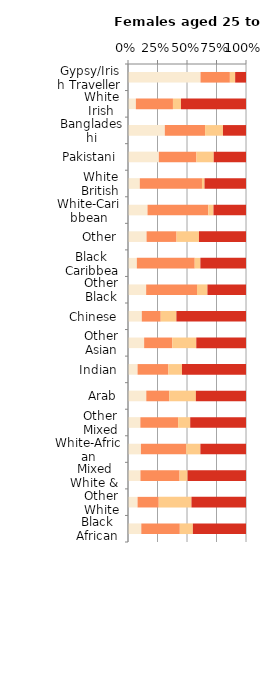
| Category | No qualifications | Below degree level qualifications | Other qualifications | Degree level qualifications |
|---|---|---|---|---|
| Gypsy/Irish Traveller | 61.453 | 24.881 | 4.473 | 9.193 |
| White Irish | 6.659 | 31.436 | 6.802 | 55.103 |
| Bangladeshi | 31.209 | 34.104 | 15.169 | 19.518 |
| Pakistani | 26.122 | 31.878 | 14.647 | 27.354 |
| White British | 9.998 | 52.687 | 2.157 | 35.158 |
| White-Caribbean | 16.537 | 51.505 | 4.393 | 27.565 |
| Other | 15.728 | 25.396 | 19.02 | 39.857 |
| Black Caribbean | 7.497 | 49.052 | 4.783 | 38.668 |
| Other Black | 15.384 | 43.101 | 8.831 | 32.683 |
| Chinese | 11.688 | 16.047 | 13.283 | 58.982 |
| Other Asian | 13.678 | 23.831 | 20.356 | 42.136 |
| Indian | 8.108 | 26.105 | 11.526 | 54.261 |
| Arab | 15.493 | 19.463 | 22.551 | 42.493 |
| Other Mixed | 10.479 | 31.988 | 10.259 | 47.274 |
| White-African | 10.962 | 38.361 | 12.02 | 38.657 |
| Mixed White & Asian | 10.556 | 33.162 | 6.764 | 49.518 |
| Other White | 8.096 | 17.956 | 27.727 | 46.221 |
| Black African | 11.278 | 32.63 | 11.068 | 45.025 |